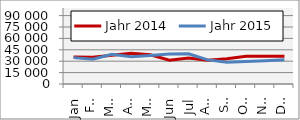
| Category | Jahr 2014 | Jahr 2015 |
|---|---|---|
| Jan | 35687.898 | 34706.958 |
| Feb | 35199.902 | 32644.765 |
| Mär | 37732.783 | 39032.227 |
| Apr | 40527.971 | 35848.179 |
| Mai | 38537.338 | 37587.484 |
| Jun | 31406.539 | 39421.747 |
| Jul | 34218.05 | 39667.467 |
| Aug | 31109.583 | 31736.154 |
| Sep | 33215.37 | 28500.343 |
| Okt | 36380.723 | 29737.434 |
| Nov | 36513.236 | 30748.382 |
| Dez | 36372.08 | 31841.109 |